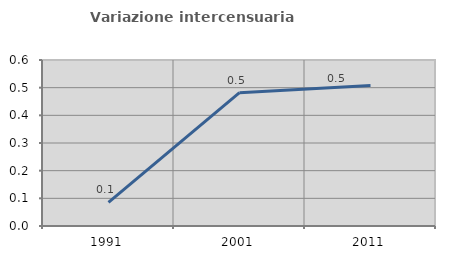
| Category | Variazione intercensuaria annua |
|---|---|
| 1991.0 | 0.085 |
| 2001.0 | 0.482 |
| 2011.0 | 0.507 |